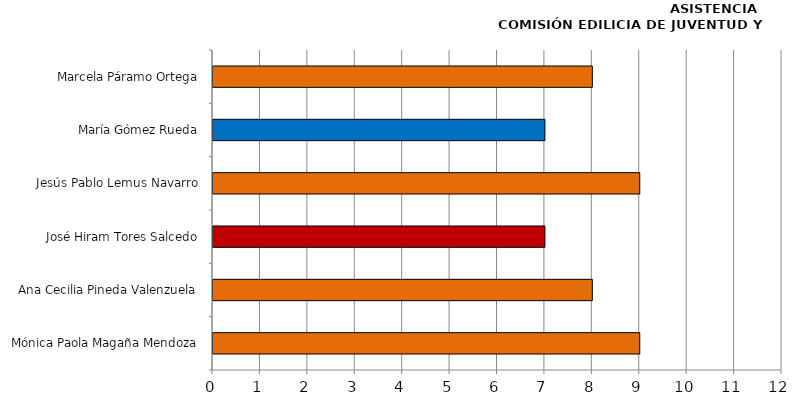
| Category | Series 0 |
|---|---|
| Mónica Paola Magaña Mendoza | 9 |
| Ana Cecilia Pineda Valenzuela | 8 |
| José Hiram Tores Salcedo | 7 |
| Jesús Pablo Lemus Navarro | 9 |
| María Gómez Rueda | 7 |
| Marcela Páramo Ortega | 8 |